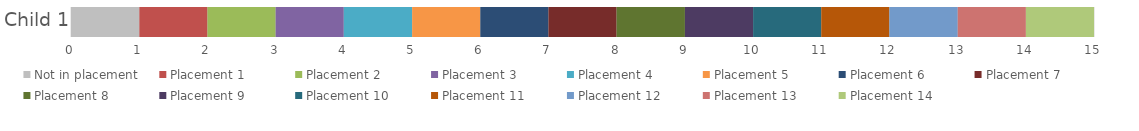
| Category | Not in placement | Placement 1 | Placement 2 | Placement 3 | Placement 4 | Placement 5 | Placement 6 | Placement 7 | Placement 8 | Placement 9 | Placement 10 | Placement 11 | Placement 12 | Placement 13 | Placement 14 |
|---|---|---|---|---|---|---|---|---|---|---|---|---|---|---|---|
| 0 | 1.002 | 0.999 | 0.999 | 0.999 | 1.002 | 0.999 | 0.999 | 0.999 | 1.002 | 0.999 | 0.999 | 0.999 | 1.002 | 0.999 | 0.999 |